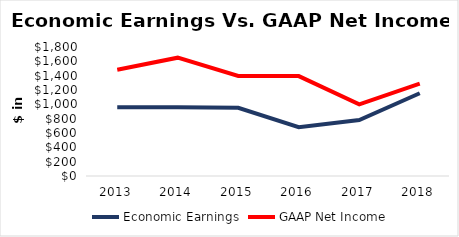
| Category | Economic Earnings | GAAP Net Income |
|---|---|---|
| 2013.0 | 958.336 | 1483 |
| 2014.0 | 958.366 | 1651 |
| 2015.0 | 952.557 | 1396 |
| 2016.0 | 680.792 | 1394 |
| 2017.0 | 781.951 | 999 |
| 2018.0 | 1154.643 | 1288 |